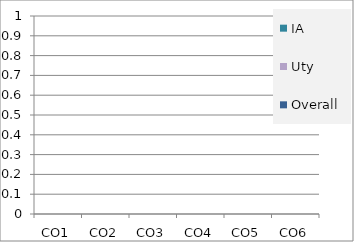
| Category | Series 0 | IA | Uty | Overall |
|---|---|---|---|---|
| CO1 |  | 0 | 0 | 0 |
| CO2 |  | 0 | 0 | 0 |
| CO3 |  | 0 | 0 | 0 |
| CO4 |  | 0 | 0 | 0 |
| CO5 |  | 0 | 0 | 0 |
| CO6 |  | 0 | 0 | 0 |